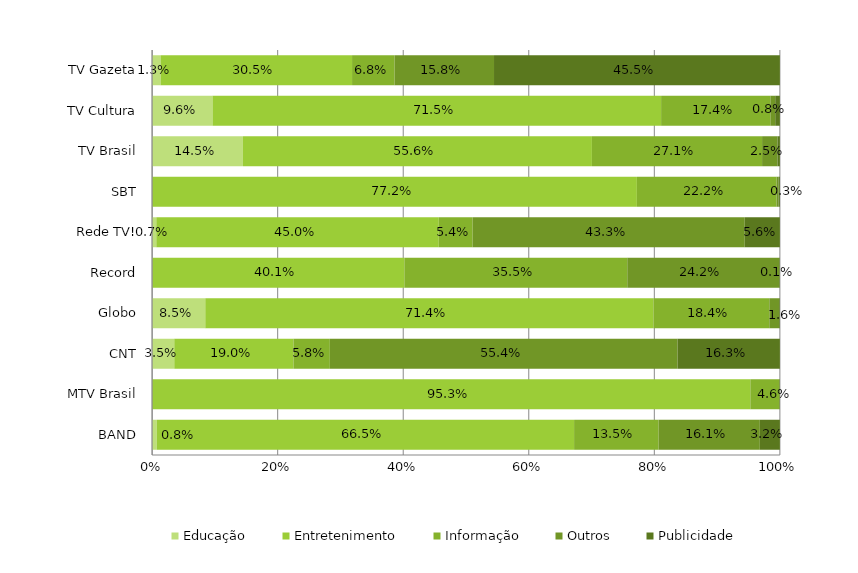
| Category | Educação | Entretenimento | Informação | Outros | Publicidade |
|---|---|---|---|---|---|
| BAND | 0.008 | 0.665 | 0.135 | 0.161 | 0.032 |
| MTV Brasil | 0 | 0.953 | 0.046 | 0 | 0.001 |
|  CNT | 0.035 | 0.19 | 0.058 | 0.554 | 0.163 |
| Globo | 0.085 | 0.714 | 0.184 | 0.016 | 0.001 |
|  Record | 0 | 0.401 | 0.355 | 0.242 | 0.001 |
| Rede TV! | 0.007 | 0.45 | 0.054 | 0.433 | 0.056 |
| SBT | 0 | 0.772 | 0.222 | 0.003 | 0.002 |
| TV Brasil | 0.145 | 0.556 | 0.271 | 0.025 | 0.004 |
| TV Cultura | 0.096 | 0.715 | 0.174 | 0.008 | 0.007 |
| TV Gazeta | 0.013 | 0.305 | 0.068 | 0.158 | 0.455 |